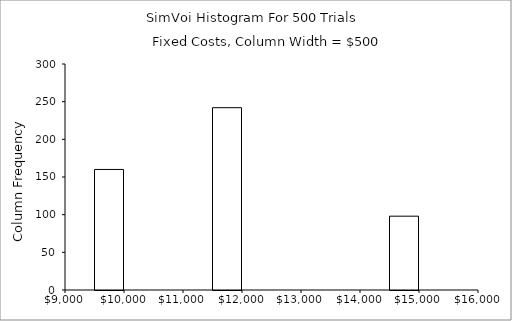
| Category | Series 0 |
|---|---|
| 9500.0 | 0 |
| 10000.0 | 160 |
| 10500.0 | 0 |
| 11000.0 | 0 |
| 11500.0 | 0 |
| 12000.0 | 242 |
| 12500.0 | 0 |
| 13000.0 | 0 |
| 13500.0 | 0 |
| 14000.0 | 0 |
| 14500.0 | 0 |
| 15000.0 | 98 |
| 15500.0 | 0 |
| 16000.0 | 0 |